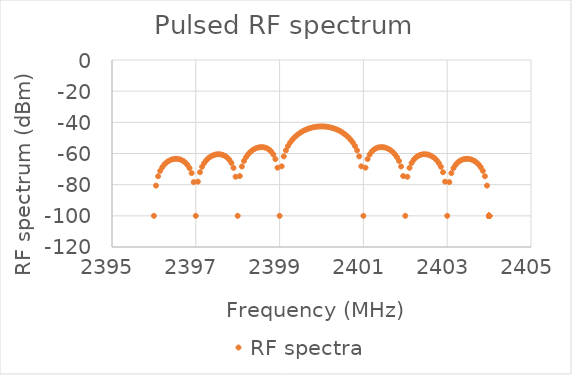
| Category | RF spectra |
|---|---|
| 2396.0 | -100 |
| 2396.05 | -80.609 |
| 2396.1 | -74.585 |
| 2396.15 | -71.132 |
| 2396.2 | -68.775 |
| 2396.25 | -67.055 |
| 2396.3 | -65.768 |
| 2396.35 | -64.812 |
| 2396.4 | -64.126 |
| 2396.45 | -63.676 |
| 2396.5 | -63.445 |
| 2396.55 | -63.428 |
| 2396.6 | -63.629 |
| 2396.65 | -64.067 |
| 2396.7 | -64.775 |
| 2396.75 | -65.812 |
| 2396.8 | -67.282 |
| 2396.85 | -69.389 |
| 2396.9 | -72.591 |
| 2396.95 | -78.363 |
| 2397.0 | -100 |
| 2397.05 | -78.073 |
| 2397.1 | -72.012 |
| 2397.15 | -68.52 |
| 2397.2 | -66.122 |
| 2397.25 | -64.361 |
| 2397.3 | -63.032 |
| 2397.35 | -62.031 |
| 2397.4 | -61.299 |
| 2397.45 | -60.802 |
| 2397.5 | -60.522 |
| 2397.55 | -60.455 |
| 2397.6 | -60.604 |
| 2397.65 | -60.987 |
| 2397.7 | -61.639 |
| 2397.75 | -62.618 |
| 2397.8 | -64.028 |
| 2397.85 | -66.071 |
| 2397.9 | -69.208 |
| 2397.95 | -74.912 |
| 2398.0 | -100 |
| 2398.05 | -74.478 |
| 2398.1 | -68.339 |
| 2398.15 | -64.766 |
| 2398.2 | -62.285 |
| 2398.25 | -60.435 |
| 2398.3 | -59.013 |
| 2398.35 | -57.916 |
| 2398.4 | -57.082 |
| 2398.45 | -56.478 |
| 2398.5 | -56.085 |
| 2398.55 | -55.899 |
| 2398.6 | -55.922 |
| 2398.65 | -56.173 |
| 2398.7 | -56.683 |
| 2398.75 | -57.512 |
| 2398.8 | -58.763 |
| 2398.85 | -60.637 |
| 2398.9 | -63.592 |
| 2398.95 | -69.101 |
| 2399.0 | -100 |
| 2399.05 | -68.231 |
| 2399.1 | -61.849 |
| 2399.15 | -58.011 |
| 2399.2 | -55.241 |
| 2399.25 | -53.075 |
| 2399.3 | -51.306 |
| 2399.35 | -49.824 |
| 2399.4 | -48.562 |
| 2399.45 | -47.478 |
| 2399.5 | -46.543 |
| 2399.55 | -45.735 |
| 2399.6 | -45.041 |
| 2399.65 | -44.447 |
| 2399.7 | -43.947 |
| 2399.75 | -43.533 |
| 2399.8 | -43.2 |
| 2399.85 | -42.944 |
| 2399.9 | -42.764 |
| 2399.95 | -42.656 |
| 2400.0 | -42.621 |
| 2400.05 | -42.656 |
| 2400.1 | -42.764 |
| 2400.15 | -42.944 |
| 2400.2 | -43.2 |
| 2400.25 | -43.533 |
| 2400.3 | -43.947 |
| 2400.35 | -44.447 |
| 2400.4 | -45.041 |
| 2400.45 | -45.735 |
| 2400.5 | -46.543 |
| 2400.55 | -47.478 |
| 2400.6 | -48.562 |
| 2400.65 | -49.824 |
| 2400.7 | -51.306 |
| 2400.75 | -53.075 |
| 2400.8 | -55.241 |
| 2400.85 | -58.011 |
| 2400.9 | -61.849 |
| 2400.95 | -68.231 |
| 2401.0 | -100 |
| 2401.05 | -69.101 |
| 2401.1 | -63.592 |
| 2401.15 | -60.637 |
| 2401.2 | -58.763 |
| 2401.25 | -57.512 |
| 2401.3 | -56.683 |
| 2401.35 | -56.173 |
| 2401.4 | -55.922 |
| 2401.45 | -55.899 |
| 2401.5 | -56.085 |
| 2401.55 | -56.478 |
| 2401.6 | -57.082 |
| 2401.65 | -57.916 |
| 2401.7 | -59.013 |
| 2401.75 | -60.435 |
| 2401.8 | -62.285 |
| 2401.85 | -64.766 |
| 2401.9 | -68.339 |
| 2401.95 | -74.478 |
| 2402.0 | -100 |
| 2402.05 | -74.912 |
| 2402.1 | -69.208 |
| 2402.15 | -66.071 |
| 2402.2 | -64.028 |
| 2402.25 | -62.618 |
| 2402.3 | -61.639 |
| 2402.35 | -60.987 |
| 2402.4 | -60.604 |
| 2402.45 | -60.455 |
| 2402.5 | -60.522 |
| 2402.55 | -60.802 |
| 2402.6 | -61.299 |
| 2402.65 | -62.031 |
| 2402.7 | -63.032 |
| 2402.75 | -64.361 |
| 2402.8 | -66.122 |
| 2402.85 | -68.52 |
| 2402.9 | -72.012 |
| 2402.95 | -78.073 |
| 2403.0 | -100 |
| 2403.05 | -78.363 |
| 2403.1 | -72.591 |
| 2403.15 | -69.389 |
| 2403.2 | -67.282 |
| 2403.25 | -65.812 |
| 2403.3 | -64.775 |
| 2403.35 | -64.067 |
| 2403.4 | -63.629 |
| 2403.45 | -63.428 |
| 2403.5 | -63.445 |
| 2403.55 | -63.676 |
| 2403.6 | -64.126 |
| 2403.65 | -64.812 |
| 2403.7 | -65.768 |
| 2403.75 | -67.055 |
| 2403.8 | -68.775 |
| 2403.85 | -71.132 |
| 2403.9 | -74.585 |
| 2403.95 | -80.609 |
| 2404.0 | -100 |
| 2404.0 | -100 |
| 2404.0 | -100 |
| 2404.0 | -100 |
| 2404.0 | -100 |
| 2404.0 | -100 |
| 2404.0 | -100 |
| 2404.0 | -100 |
| 2404.0 | -100 |
| 2404.0 | -100 |
| 2404.0 | -100 |
| 2404.0 | -100 |
| 2404.0 | -100 |
| 2404.0 | -100 |
| 2404.0 | -100 |
| 2404.0 | -100 |
| 2404.0 | -100 |
| 2404.0 | -100 |
| 2404.0 | -100 |
| 2404.0 | -100 |
| 2404.0 | -100 |
| 2404.0 | -100 |
| 2404.0 | -100 |
| 2404.0 | -100 |
| 2404.0 | -100 |
| 2404.0 | -100 |
| 2404.0 | -100 |
| 2404.0 | -100 |
| 2404.0 | -100 |
| 2404.0 | -100 |
| 2404.0 | -100 |
| 2404.0 | -100 |
| 2404.0 | -100 |
| 2404.0 | -100 |
| 2404.0 | -100 |
| 2404.0 | -100 |
| 2404.0 | -100 |
| 2404.0 | -100 |
| 2404.0 | -100 |
| 2404.0 | -100 |
| 2404.0 | -100 |
| 2404.0 | -100 |
| 2404.0 | -100 |
| 2404.0 | -100 |
| 2404.0 | -100 |
| 2404.0 | -100 |
| 2404.0 | -100 |
| 2404.0 | -100 |
| 2404.0 | -100 |
| 2404.0 | -100 |
| 2404.0 | -100 |
| 2404.0 | -100 |
| 2404.0 | -100 |
| 2404.0 | -100 |
| 2404.0 | -100 |
| 2404.0 | -100 |
| 2404.0 | -100 |
| 2404.0 | -100 |
| 2404.0 | -100 |
| 2404.0 | -100 |
| 2404.0 | -100 |
| 2404.0 | -100 |
| 2404.0 | -100 |
| 2404.0 | -100 |
| 2404.0 | -100 |
| 2404.0 | -100 |
| 2404.0 | -100 |
| 2404.0 | -100 |
| 2404.0 | -100 |
| 2404.0 | -100 |
| 2404.0 | -100 |
| 2404.0 | -100 |
| 2404.0 | -100 |
| 2404.0 | -100 |
| 2404.0 | -100 |
| 2404.0 | -100 |
| 2404.0 | -100 |
| 2404.0 | -100 |
| 2404.0 | -100 |
| 2404.0 | -100 |
| 2404.0 | -100 |
| 2404.0 | -100 |
| 2404.0 | -100 |
| 2404.0 | -100 |
| 2404.0 | -100 |
| 2404.0 | -100 |
| 2404.0 | -100 |
| 2404.0 | -100 |
| 2404.0 | -100 |
| 2404.0 | -100 |
| 2404.0 | -100 |
| 2404.0 | -100 |
| 2404.0 | -100 |
| 2404.0 | -100 |
| 2404.0 | -100 |
| 2404.0 | -100 |
| 2404.0 | -100 |
| 2404.0 | -100 |
| 2404.0 | -100 |
| 2404.0 | -100 |
| 2404.0 | -100 |
| 2404.0 | -100 |
| 2404.0 | -100 |
| 2404.0 | -100 |
| 2404.0 | -100 |
| 2404.0 | -100 |
| 2404.0 | -100 |
| 2404.0 | -100 |
| 2404.0 | -100 |
| 2404.0 | -100 |
| 2404.0 | -100 |
| 2404.0 | -100 |
| 2404.0 | -100 |
| 2404.0 | -100 |
| 2404.0 | -100 |
| 2404.0 | -100 |
| 2404.0 | -100 |
| 2404.0 | -100 |
| 2404.0 | -100 |
| 2404.0 | -100 |
| 2404.0 | -100 |
| 2404.0 | -100 |
| 2404.0 | -100 |
| 2404.0 | -100 |
| 2404.0 | -100 |
| 2404.0 | -100 |
| 2404.0 | -100 |
| 2404.0 | -100 |
| 2404.0 | -100 |
| 2404.0 | -100 |
| 2404.0 | -100 |
| 2404.0 | -100 |
| 2404.0 | -100 |
| 2404.0 | -100 |
| 2404.0 | -100 |
| 2404.0 | -100 |
| 2404.0 | -100 |
| 2404.0 | -100 |
| 2404.0 | -100 |
| 2404.0 | -100 |
| 2404.0 | -100 |
| 2404.0 | -100 |
| 2404.0 | -100 |
| 2404.0 | -100 |
| 2404.0 | -100 |
| 2404.0 | -100 |
| 2404.0 | -100 |
| 2404.0 | -100 |
| 2404.0 | -100 |
| 2404.0 | -100 |
| 2404.0 | -100 |
| 2404.0 | -100 |
| 2404.0 | -100 |
| 2404.0 | -100 |
| 2404.0 | -100 |
| 2404.0 | -100 |
| 2404.0 | -100 |
| 2404.0 | -100 |
| 2404.0 | -100 |
| 2404.0 | -100 |
| 2404.0 | -100 |
| 2404.0 | -100 |
| 2404.0 | -100 |
| 2404.0 | -100 |
| 2404.0 | -100 |
| 2404.0 | -100 |
| 2404.0 | -100 |
| 2404.0 | -100 |
| 2404.0 | -100 |
| 2404.0 | -100 |
| 2404.0 | -100 |
| 2404.0 | -100 |
| 2404.0 | -100 |
| 2404.0 | -100 |
| 2404.0 | -100 |
| 2404.0 | -100 |
| 2404.0 | -100 |
| 2404.0 | -100 |
| 2404.0 | -100 |
| 2404.0 | -100 |
| 2404.0 | -100 |
| 2404.0 | -100 |
| 2404.0 | -100 |
| 2404.0 | -100 |
| 2404.0 | -100 |
| 2404.0 | -100 |
| 2404.0 | -100 |
| 2404.0 | -100 |
| 2404.0 | -100 |
| 2404.0 | -100 |
| 2404.0 | -100 |
| 2404.0 | -100 |
| 2404.0 | -100 |
| 2404.0 | -100 |
| 2404.0 | -100 |
| 2404.0 | -100 |
| 2404.0 | -100 |
| 2404.0 | -100 |
| 2404.0 | -100 |
| 2404.0 | -100 |
| 2404.0 | -100 |
| 2404.0 | -100 |
| 2404.0 | -100 |
| 2404.0 | -100 |
| 2404.0 | -100 |
| 2404.0 | -100 |
| 2404.0 | -100 |
| 2404.0 | -100 |
| 2404.0 | -100 |
| 2404.0 | -100 |
| 2404.0 | -100 |
| 2404.0 | -100 |
| 2404.0 | -100 |
| 2404.0 | -100 |
| 2404.0 | -100 |
| 2404.0 | -100 |
| 2404.0 | -100 |
| 2404.0 | -100 |
| 2404.0 | -100 |
| 2404.0 | -100 |
| 2404.0 | -100 |
| 2404.0 | -100 |
| 2404.0 | -100 |
| 2404.0 | -100 |
| 2404.0 | -100 |
| 2404.0 | -100 |
| 2404.0 | -100 |
| 2404.0 | -100 |
| 2404.0 | -100 |
| 2404.0 | -100 |
| 2404.0 | -100 |
| 2404.0 | -100 |
| 2404.0 | -100 |
| 2404.0 | -100 |
| 2404.0 | -100 |
| 2404.0 | -100 |
| 2404.0 | -100 |
| 2404.0 | -100 |
| 2404.0 | -100 |
| 2404.0 | -100 |
| 2404.0 | -100 |
| 2404.0 | -100 |
| 2404.0 | -100 |
| 2404.0 | -100 |
| 2404.0 | -100 |
| 2404.0 | -100 |
| 2404.0 | -100 |
| 2404.0 | -100 |
| 2404.0 | -100 |
| 2404.0 | -100 |
| 2404.0 | -100 |
| 2404.0 | -100 |
| 2404.0 | -100 |
| 2404.0 | -100 |
| 2404.0 | -100 |
| 2404.0 | -100 |
| 2404.0 | -100 |
| 2404.0 | -100 |
| 2404.0 | -100 |
| 2404.0 | -100 |
| 2404.0 | -100 |
| 2404.0 | -100 |
| 2404.0 | -100 |
| 2404.0 | -100 |
| 2404.0 | -100 |
| 2404.0 | -100 |
| 2404.0 | -100 |
| 2404.0 | -100 |
| 2404.0 | -100 |
| 2404.0 | -100 |
| 2404.0 | -100 |
| 2404.0 | -100 |
| 2404.0 | -100 |
| 2404.0 | -100 |
| 2404.0 | -100 |
| 2404.0 | -100 |
| 2404.0 | -100 |
| 2404.0 | -100 |
| 2404.0 | -100 |
| 2404.0 | -100 |
| 2404.0 | -100 |
| 2404.0 | -100 |
| 2404.0 | -100 |
| 2404.0 | -100 |
| 2404.0 | -100 |
| 2404.0 | -100 |
| 2404.0 | -100 |
| 2404.0 | -100 |
| 2404.0 | -100 |
| 2404.0 | -100 |
| 2404.0 | -100 |
| 2404.0 | -100 |
| 2404.0 | -100 |
| 2404.0 | -100 |
| 2404.0 | -100 |
| 2404.0 | -100 |
| 2404.0 | -100 |
| 2404.0 | -100 |
| 2404.0 | -100 |
| 2404.0 | -100 |
| 2404.0 | -100 |
| 2404.0 | -100 |
| 2404.0 | -100 |
| 2404.0 | -100 |
| 2404.0 | -100 |
| 2404.0 | -100 |
| 2404.0 | -100 |
| 2404.0 | -100 |
| 2404.0 | -100 |
| 2404.0 | -100 |
| 2404.0 | -100 |
| 2404.0 | -100 |
| 2404.0 | -100 |
| 2404.0 | -100 |
| 2404.0 | -100 |
| 2404.0 | -100 |
| 2404.0 | -100 |
| 2404.0 | -100 |
| 2404.0 | -100 |
| 2404.0 | -100 |
| 2404.0 | -100 |
| 2404.0 | -100 |
| 2404.0 | -100 |
| 2404.0 | -100 |
| 2404.0 | -100 |
| 2404.0 | -100 |
| 2404.0 | -100 |
| 2404.0 | -100 |
| 2404.0 | -100 |
| 2404.0 | -100 |
| 2404.0 | -100 |
| 2404.0 | -100 |
| 2404.0 | -100 |
| 2404.0 | -100 |
| 2404.0 | -100 |
| 2404.0 | -100 |
| 2404.0 | -100 |
| 2404.0 | -100 |
| 2404.0 | -100 |
| 2404.0 | -100 |
| 2404.0 | -100 |
| 2404.0 | -100 |
| 2404.0 | -100 |
| 2404.0 | -100 |
| 2404.0 | -100 |
| 2404.0 | -100 |
| 2404.0 | -100 |
| 2404.0 | -100 |
| 2404.0 | -100 |
| 2404.0 | -100 |
| 2404.0 | -100 |
| 2404.0 | -100 |
| 2404.0 | -100 |
| 2404.0 | -100 |
| 2404.0 | -100 |
| 2404.0 | -100 |
| 2404.0 | -100 |
| 2404.0 | -100 |
| 2404.0 | -100 |
| 2404.0 | -100 |
| 2404.0 | -100 |
| 2404.0 | -100 |
| 2404.0 | -100 |
| 2404.0 | -100 |
| 2404.0 | -100 |
| 2404.0 | -100 |
| 2404.0 | -100 |
| 2404.0 | -100 |
| 2404.0 | -100 |
| 2404.0 | -100 |
| 2404.0 | -100 |
| 2404.0 | -100 |
| 2404.0 | -100 |
| 2404.0 | -100 |
| 2404.0 | -100 |
| 2404.0 | -100 |
| 2404.0 | -100 |
| 2404.0 | -100 |
| 2404.0 | -100 |
| 2404.0 | -100 |
| 2404.0 | -100 |
| 2404.0 | -100 |
| 2404.0 | -100 |
| 2404.0 | -100 |
| 2404.0 | -100 |
| 2404.0 | -100 |
| 2404.0 | -100 |
| 2404.0 | -100 |
| 2404.0 | -100 |
| 2404.0 | -100 |
| 2404.0 | -100 |
| 2404.0 | -100 |
| 2404.0 | -100 |
| 2404.0 | -100 |
| 2404.0 | -100 |
| 2404.0 | -100 |
| 2404.0 | -100 |
| 2404.0 | -100 |
| 2404.0 | -100 |
| 2404.0 | -100 |
| 2404.0 | -100 |
| 2404.0 | -100 |
| 2404.0 | -100 |
| 2404.0 | -100 |
| 2404.0 | -100 |
| 2404.0 | -100 |
| 2404.0 | -100 |
| 2404.0 | -100 |
| 2404.0 | -100 |
| 2404.0 | -100 |
| 2404.0 | -100 |
| 2404.0 | -100 |
| 2404.0 | -100 |
| 2404.0 | -100 |
| 2404.0 | -100 |
| 2404.0 | -100 |
| 2404.0 | -100 |
| 2404.0 | -100 |
| 2404.0 | -100 |
| 2404.0 | -100 |
| 2404.0 | -100 |
| 2404.0 | -100 |
| 2404.0 | -100 |
| 2404.0 | -100 |
| 2404.0 | -100 |
| 2404.0 | -100 |
| 2404.0 | -100 |
| 2404.0 | -100 |
| 2404.0 | -100 |
| 2404.0 | -100 |
| 2404.0 | -100 |
| 2404.0 | -100 |
| 2404.0 | -100 |
| 2404.0 | -100 |
| 2404.0 | -100 |
| 2404.0 | -100 |
| 2404.0 | -100 |
| 2404.0 | -100 |
| 2404.0 | -100 |
| 2404.0 | -100 |
| 2404.0 | -100 |
| 2404.0 | -100 |
| 2404.0 | -100 |
| 2404.0 | -100 |
| 2404.0 | -100 |
| 2404.0 | -100 |
| 2404.0 | -100 |
| 2404.0 | -100 |
| 2404.0 | -100 |
| 2404.0 | -100 |
| 2404.0 | -100 |
| 2404.0 | -100 |
| 2404.0 | -100 |
| 2404.0 | -100 |
| 2404.0 | -100 |
| 2404.0 | -100 |
| 2404.0 | -100 |
| 2404.0 | -100 |
| 2404.0 | -100 |
| 2404.0 | -100 |
| 2404.0 | -100 |
| 2404.0 | -100 |
| 2404.0 | -100 |
| 2404.0 | -100 |
| 2404.0 | -100 |
| 2404.0 | -100 |
| 2404.0 | -100 |
| 2404.0 | -100 |
| 2404.0 | -100 |
| 2404.0 | -100 |
| 2404.0 | -100 |
| 2404.0 | -100 |
| 2404.0 | -100 |
| 2404.0 | -100 |
| 2404.0 | -100 |
| 2404.0 | -100 |
| 2404.0 | -100 |
| 2404.0 | -100 |
| 2404.0 | -100 |
| 2404.0 | -100 |
| 2404.0 | -100 |
| 2404.0 | -100 |
| 2404.0 | -100 |
| 2404.0 | -100 |
| 2404.0 | -100 |
| 2404.0 | -100 |
| 2404.0 | -100 |
| 2404.0 | -100 |
| 2404.0 | -100 |
| 2404.0 | -100 |
| 2404.0 | -100 |
| 2404.0 | -100 |
| 2404.0 | -100 |
| 2404.0 | -100 |
| 2404.0 | -100 |
| 2404.0 | -100 |
| 2404.0 | -100 |
| 2404.0 | -100 |
| 2404.0 | -100 |
| 2404.0 | -100 |
| 2404.0 | -100 |
| 2404.0 | -100 |
| 2404.0 | -100 |
| 2404.0 | -100 |
| 2404.0 | -100 |
| 2404.0 | -100 |
| 2404.0 | -100 |
| 2404.0 | -100 |
| 2404.0 | -100 |
| 2404.0 | -100 |
| 2404.0 | -100 |
| 2404.0 | -100 |
| 2404.0 | -100 |
| 2404.0 | -100 |
| 2404.0 | -100 |
| 2404.0 | -100 |
| 2404.0 | -100 |
| 2404.0 | -100 |
| 2404.0 | -100 |
| 2404.0 | -100 |
| 2404.0 | -100 |
| 2404.0 | -100 |
| 2404.0 | -100 |
| 2404.0 | -100 |
| 2404.0 | -100 |
| 2404.0 | -100 |
| 2404.0 | -100 |
| 2404.0 | -100 |
| 2404.0 | -100 |
| 2404.0 | -100 |
| 2404.0 | -100 |
| 2404.0 | -100 |
| 2404.0 | -100 |
| 2404.0 | -100 |
| 2404.0 | -100 |
| 2404.0 | -100 |
| 2404.0 | -100 |
| 2404.0 | -100 |
| 2404.0 | -100 |
| 2404.0 | -100 |
| 2404.0 | -100 |
| 2404.0 | -100 |
| 2404.0 | -100 |
| 2404.0 | -100 |
| 2404.0 | -100 |
| 2404.0 | -100 |
| 2404.0 | -100 |
| 2404.0 | -100 |
| 2404.0 | -100 |
| 2404.0 | -100 |
| 2404.0 | -100 |
| 2404.0 | -100 |
| 2404.0 | -100 |
| 2404.0 | -100 |
| 2404.0 | -100 |
| 2404.0 | -100 |
| 2404.0 | -100 |
| 2404.0 | -100 |
| 2404.0 | -100 |
| 2404.0 | -100 |
| 2404.0 | -100 |
| 2404.0 | -100 |
| 2404.0 | -100 |
| 2404.0 | -100 |
| 2404.0 | -100 |
| 2404.0 | -100 |
| 2404.0 | -100 |
| 2404.0 | -100 |
| 2404.0 | -100 |
| 2404.0 | -100 |
| 2404.0 | -100 |
| 2404.0 | -100 |
| 2404.0 | -100 |
| 2404.0 | -100 |
| 2404.0 | -100 |
| 2404.0 | -100 |
| 2404.0 | -100 |
| 2404.0 | -100 |
| 2404.0 | -100 |
| 2404.0 | -100 |
| 2404.0 | -100 |
| 2404.0 | -100 |
| 2404.0 | -100 |
| 2404.0 | -100 |
| 2404.0 | -100 |
| 2404.0 | -100 |
| 2404.0 | -100 |
| 2404.0 | -100 |
| 2404.0 | -100 |
| 2404.0 | -100 |
| 2404.0 | -100 |
| 2404.0 | -100 |
| 2404.0 | -100 |
| 2404.0 | -100 |
| 2404.0 | -100 |
| 2404.0 | -100 |
| 2404.0 | -100 |
| 2404.0 | -100 |
| 2404.0 | -100 |
| 2404.0 | -100 |
| 2404.0 | -100 |
| 2404.0 | -100 |
| 2404.0 | -100 |
| 2404.0 | -100 |
| 2404.0 | -100 |
| 2404.0 | -100 |
| 2404.0 | -100 |
| 2404.0 | -100 |
| 2404.0 | -100 |
| 2404.0 | -100 |
| 2404.0 | -100 |
| 2404.0 | -100 |
| 2404.0 | -100 |
| 2404.0 | -100 |
| 2404.0 | -100 |
| 2404.0 | -100 |
| 2404.0 | -100 |
| 2404.0 | -100 |
| 2404.0 | -100 |
| 2404.0 | -100 |
| 2404.0 | -100 |
| 2404.0 | -100 |
| 2404.0 | -100 |
| 2404.0 | -100 |
| 2404.0 | -100 |
| 2404.0 | -100 |
| 2404.0 | -100 |
| 2404.0 | -100 |
| 2404.0 | -100 |
| 2404.0 | -100 |
| 2404.0 | -100 |
| 2404.0 | -100 |
| 2404.0 | -100 |
| 2404.0 | -100 |
| 2404.0 | -100 |
| 2404.0 | -100 |
| 2404.0 | -100 |
| 2404.0 | -100 |
| 2404.0 | -100 |
| 2404.0 | -100 |
| 2404.0 | -100 |
| 2404.0 | -100 |
| 2404.0 | -100 |
| 2404.0 | -100 |
| 2404.0 | -100 |
| 2404.0 | -100 |
| 2404.0 | -100 |
| 2404.0 | -100 |
| 2404.0 | -100 |
| 2404.0 | -100 |
| 2404.0 | -100 |
| 2404.0 | -100 |
| 2404.0 | -100 |
| 2404.0 | -100 |
| 2404.0 | -100 |
| 2404.0 | -100 |
| 2404.0 | -100 |
| 2404.0 | -100 |
| 2404.0 | -100 |
| 2404.0 | -100 |
| 2404.0 | -100 |
| 2404.0 | -100 |
| 2404.0 | -100 |
| 2404.0 | -100 |
| 2404.0 | -100 |
| 2404.0 | -100 |
| 2404.0 | -100 |
| 2404.0 | -100 |
| 2404.0 | -100 |
| 2404.0 | -100 |
| 2404.0 | -100 |
| 2404.0 | -100 |
| 2404.0 | -100 |
| 2404.0 | -100 |
| 2404.0 | -100 |
| 2404.0 | -100 |
| 2404.0 | -100 |
| 2404.0 | -100 |
| 2404.0 | -100 |
| 2404.0 | -100 |
| 2404.0 | -100 |
| 2404.0 | -100 |
| 2404.0 | -100 |
| 2404.0 | -100 |
| 2404.0 | -100 |
| 2404.0 | -100 |
| 2404.0 | -100 |
| 2404.0 | -100 |
| 2404.0 | -100 |
| 2404.0 | -100 |
| 2404.0 | -100 |
| 2404.0 | -100 |
| 2404.0 | -100 |
| 2404.0 | -100 |
| 2404.0 | -100 |
| 2404.0 | -100 |
| 2404.0 | -100 |
| 2404.0 | -100 |
| 2404.0 | -100 |
| 2404.0 | -100 |
| 2404.0 | -100 |
| 2404.0 | -100 |
| 2404.0 | -100 |
| 2404.0 | -100 |
| 2404.0 | -100 |
| 2404.0 | -100 |
| 2404.0 | -100 |
| 2404.0 | -100 |
| 2404.0 | -100 |
| 2404.0 | -100 |
| 2404.0 | -100 |
| 2404.0 | -100 |
| 2404.0 | -100 |
| 2404.0 | -100 |
| 2404.0 | -100 |
| 2404.0 | -100 |
| 2404.0 | -100 |
| 2404.0 | -100 |
| 2404.0 | -100 |
| 2404.0 | -100 |
| 2404.0 | -100 |
| 2404.0 | -100 |
| 2404.0 | -100 |
| 2404.0 | -100 |
| 2404.0 | -100 |
| 2404.0 | -100 |
| 2404.0 | -100 |
| 2404.0 | -100 |
| 2404.0 | -100 |
| 2404.0 | -100 |
| 2404.0 | -100 |
| 2404.0 | -100 |
| 2404.0 | -100 |
| 2404.0 | -100 |
| 2404.0 | -100 |
| 2404.0 | -100 |
| 2404.0 | -100 |
| 2404.0 | -100 |
| 2404.0 | -100 |
| 2404.0 | -100 |
| 2404.0 | -100 |
| 2404.0 | -100 |
| 2404.0 | -100 |
| 2404.0 | -100 |
| 2404.0 | -100 |
| 2404.0 | -100 |
| 2404.0 | -100 |
| 2404.0 | -100 |
| 2404.0 | -100 |
| 2404.0 | -100 |
| 2404.0 | -100 |
| 2404.0 | -100 |
| 2404.0 | -100 |
| 2404.0 | -100 |
| 2404.0 | -100 |
| 2404.0 | -100 |
| 2404.0 | -100 |
| 2404.0 | -100 |
| 2404.0 | -100 |
| 2404.0 | -100 |
| 2404.0 | -100 |
| 2404.0 | -100 |
| 2404.0 | -100 |
| 2404.0 | -100 |
| 2404.0 | -100 |
| 2404.0 | -100 |
| 2404.0 | -100 |
| 2404.0 | -100 |
| 2404.0 | -100 |
| 2404.0 | -100 |
| 2404.0 | -100 |
| 2404.0 | -100 |
| 2404.0 | -100 |
| 2404.0 | -100 |
| 2404.0 | -100 |
| 2404.0 | -100 |
| 2404.0 | -100 |
| 2404.0 | -100 |
| 2404.0 | -100 |
| 2404.0 | -100 |
| 2404.0 | -100 |
| 2404.0 | -100 |
| 2404.0 | -100 |
| 2404.0 | -100 |
| 2404.0 | -100 |
| 2404.0 | -100 |
| 2404.0 | -100 |
| 2404.0 | -100 |
| 2404.0 | -100 |
| 2404.0 | -100 |
| 2404.0 | -100 |
| 2404.0 | -100 |
| 2404.0 | -100 |
| 2404.0 | -100 |
| 2404.0 | -100 |
| 2404.0 | -100 |
| 2404.0 | -100 |
| 2404.0 | -100 |
| 2404.0 | -100 |
| 2404.0 | -100 |
| 2404.0 | -100 |
| 2404.0 | -100 |
| 2404.0 | -100 |
| 2404.0 | -100 |
| 2404.0 | -100 |
| 2404.0 | -100 |
| 2404.0 | -100 |
| 2404.0 | -100 |
| 2404.0 | -100 |
| 2404.0 | -100 |
| 2404.0 | -100 |
| 2404.0 | -100 |
| 2404.0 | -100 |
| 2404.0 | -100 |
| 2404.0 | -100 |
| 2404.0 | -100 |
| 2404.0 | -100 |
| 2404.0 | -100 |
| 2404.0 | -100 |
| 2404.0 | -100 |
| 2404.0 | -100 |
| 2404.0 | -100 |
| 2404.0 | -100 |
| 2404.0 | -100 |
| 2404.0 | -100 |
| 2404.0 | -100 |
| 2404.0 | -100 |
| 2404.0 | -100 |
| 2404.0 | -100 |
| 2404.0 | -100 |
| 2404.0 | -100 |
| 2404.0 | -100 |
| 2404.0 | -100 |
| 2404.0 | -100 |
| 2404.0 | -100 |
| 2404.0 | -100 |
| 2404.0 | -100 |
| 2404.0 | -100 |
| 2404.0 | -100 |
| 2404.0 | -100 |
| 2404.0 | -100 |
| 2404.0 | -100 |
| 2404.0 | -100 |
| 2404.0 | -100 |
| 2404.0 | -100 |
| 2404.0 | -100 |
| 2404.0 | -100 |
| 2404.0 | -100 |
| 2404.0 | -100 |
| 2404.0 | -100 |
| 2404.0 | -100 |
| 2404.0 | -100 |
| 2404.0 | -100 |
| 2404.0 | -100 |
| 2404.0 | -100 |
| 2404.0 | -100 |
| 2404.0 | -100 |
| 2404.0 | -100 |
| 2404.0 | -100 |
| 2404.0 | -100 |
| 2404.0 | -100 |
| 2404.0 | -100 |
| 2404.0 | -100 |
| 2404.0 | -100 |
| 2404.0 | -100 |
| 2404.0 | -100 |
| 2404.0 | -100 |
| 2404.0 | -100 |
| 2404.0 | -100 |
| 2404.0 | -100 |
| 2404.0 | -100 |
| 2404.0 | -100 |
| 2404.0 | -100 |
| 2404.0 | -100 |
| 2404.0 | -100 |
| 2404.0 | -100 |
| 2404.0 | -100 |
| 2404.0 | -100 |
| 2404.0 | -100 |
| 2404.0 | -100 |
| 2404.0 | -100 |
| 2404.0 | -100 |
| 2404.0 | -100 |
| 2404.0 | -100 |
| 2404.0 | -100 |
| 2404.0 | -100 |
| 2404.0 | -100 |
| 2404.0 | -100 |
| 2404.0 | -100 |
| 2404.0 | -100 |
| 2404.0 | -100 |
| 2404.0 | -100 |
| 2404.0 | -100 |
| 2404.0 | -100 |
| 2404.0 | -100 |
| 2404.0 | -100 |
| 2404.0 | -100 |
| 2404.0 | -100 |
| 2404.0 | -100 |
| 2404.0 | -100 |
| 2404.0 | -100 |
| 2404.0 | -100 |
| 2404.0 | -100 |
| 2404.0 | -100 |
| 2404.0 | -100 |
| 2404.0 | -100 |
| 2404.0 | -100 |
| 2404.0 | -100 |
| 2404.0 | -100 |
| 2404.0 | -100 |
| 2404.0 | -100 |
| 2404.0 | -100 |
| 2404.0 | -100 |
| 2404.0 | -100 |
| 2404.0 | -100 |
| 2404.0 | -100 |
| 2404.0 | -100 |
| 2404.0 | -100 |
| 2404.0 | -100 |
| 2404.0 | -100 |
| 2404.0 | -100 |
| 2404.0 | -100 |
| 2404.0 | -100 |
| 2404.0 | -100 |
| 2404.0 | -100 |
| 2404.0 | -100 |
| 2404.0 | -100 |
| 2404.0 | -100 |
| 2404.0 | -100 |
| 2404.0 | -100 |
| 2404.0 | -100 |
| 2404.0 | -100 |
| 2404.0 | -100 |
| 2404.0 | -100 |
| 2404.0 | -100 |
| 2404.0 | -100 |
| 2404.0 | -100 |
| 2404.0 | -100 |
| 2404.0 | -100 |
| 2404.0 | -100 |
| 2404.0 | -100 |
| 2404.0 | -100 |
| 2404.0 | -100 |
| 2404.0 | -100 |
| 2404.0 | -100 |
| 2404.0 | -100 |
| 2404.0 | -100 |
| 2404.0 | -100 |
| 2404.0 | -100 |
| 2404.0 | -100 |
| 2404.0 | -100 |
| 2404.0 | -100 |
| 2404.0 | -100 |
| 2404.0 | -100 |
| 2404.0 | -100 |
| 2404.0 | -100 |
| 2404.0 | -100 |
| 2404.0 | -100 |
| 2404.0 | -100 |
| 2404.0 | -100 |
| 2404.0 | -100 |
| 2404.0 | -100 |
| 2404.0 | -100 |
| 2404.0 | -100 |
| 2404.0 | -100 |
| 2404.0 | -100 |
| 2404.0 | -100 |
| 2404.0 | -100 |
| 2404.0 | -100 |
| 2404.0 | -100 |
| 2404.0 | -100 |
| 2404.0 | -100 |
| 2404.0 | -100 |
| 2404.0 | -100 |
| 2404.0 | -100 |
| 2404.0 | -100 |
| 2404.0 | -100 |
| 2404.0 | -100 |
| 2404.0 | -100 |
| 2404.0 | -100 |
| 2404.0 | -100 |
| 2404.0 | -100 |
| 2404.0 | -100 |
| 2404.0 | -100 |
| 2404.0 | -100 |
| 2404.0 | -100 |
| 2404.0 | -100 |
| 2404.0 | -100 |
| 2404.0 | -100 |
| 2404.0 | -100 |
| 2404.0 | -100 |
| 2404.0 | -100 |
| 2404.0 | -100 |
| 2404.0 | -100 |
| 2404.0 | -100 |
| 2404.0 | -100 |
| 2404.0 | -100 |
| 2404.0 | -100 |
| 2404.0 | -100 |
| 2404.0 | -100 |
| 2404.0 | -100 |
| 2404.0 | -100 |
| 2404.0 | -100 |
| 2404.0 | -100 |
| 2404.0 | -100 |
| 2404.0 | -100 |
| 2404.0 | -100 |
| 2404.0 | -100 |
| 2404.0 | -100 |
| 2404.0 | -100 |
| 2404.0 | -100 |
| 2404.0 | -100 |
| 2404.0 | -100 |
| 2404.0 | -100 |
| 2404.0 | -100 |
| 2404.0 | -100 |
| 2404.0 | -100 |
| 2404.0 | -100 |
| 2404.0 | -100 |
| 2404.0 | -100 |
| 2404.0 | -100 |
| 2404.0 | -100 |
| 2404.0 | -100 |
| 2404.0 | -100 |
| 2404.0 | -100 |
| 2404.0 | -100 |
| 2404.0 | -100 |
| 2404.0 | -100 |
| 2404.0 | -100 |
| 2404.0 | -100 |
| 2404.0 | -100 |
| 2404.0 | -100 |
| 2404.0 | -100 |
| 2404.0 | -100 |
| 2404.0 | -100 |
| 2404.0 | -100 |
| 2404.0 | -100 |
| 2404.0 | -100 |
| 2404.0 | -100 |
| 2404.0 | -100 |
| 2404.0 | -100 |
| 2404.0 | -100 |
| 2404.0 | -100 |
| 2404.0 | -100 |
| 2404.0 | -100 |
| 2404.0 | -100 |
| 2404.0 | -100 |
| 2404.0 | -100 |
| 2404.0 | -100 |
| 2404.0 | -100 |
| 2404.0 | -100 |
| 2404.0 | -100 |
| 2404.0 | -100 |
| 2404.0 | -100 |
| 2404.0 | -100 |
| 2404.0 | -100 |
| 2404.0 | -100 |
| 2404.0 | -100 |
| 2404.0 | -100 |
| 2404.0 | -100 |
| 2404.0 | -100 |
| 2404.0 | -100 |
| 2404.0 | -100 |
| 2404.0 | -100 |
| 2404.0 | -100 |
| 2404.0 | -100 |
| 2404.0 | -100 |
| 2404.0 | -100 |
| 2404.0 | -100 |
| 2404.0 | -100 |
| 2404.0 | -100 |
| 2404.0 | -100 |
| 2404.0 | -100 |
| 2404.0 | -100 |
| 2404.0 | -100 |
| 2404.0 | -100 |
| 2404.0 | -100 |
| 2404.0 | -100 |
| 2404.0 | -100 |
| 2404.0 | -100 |
| 2404.0 | -100 |
| 2404.0 | -100 |
| 2404.0 | -100 |
| 2404.0 | -100 |
| 2404.0 | -100 |
| 2404.0 | -100 |
| 2404.0 | -100 |
| 2404.0 | -100 |
| 2404.0 | -100 |
| 2404.0 | -100 |
| 2404.0 | -100 |
| 2404.0 | -100 |
| 2404.0 | -100 |
| 2404.0 | -100 |
| 2404.0 | -100 |
| 2404.0 | -100 |
| 2404.0 | -100 |
| 2404.0 | -100 |
| 2404.0 | -100 |
| 2404.0 | -100 |
| 2404.0 | -100 |
| 2404.0 | -100 |
| 2404.0 | -100 |
| 2404.0 | -100 |
| 2404.0 | -100 |
| 2404.0 | -100 |
| 2404.0 | -100 |
| 2404.0 | -100 |
| 2404.0 | -100 |
| 2404.0 | -100 |
| 2404.0 | -100 |
| 2404.0 | -100 |
| 2404.0 | -100 |
| 2404.0 | -100 |
| 2404.0 | -100 |
| 2404.0 | -100 |
| 2404.0 | -100 |
| 2404.0 | -100 |
| 2404.0 | -100 |
| 2404.0 | -100 |
| 2404.0 | -100 |
| 2404.0 | -100 |
| 2404.0 | -100 |
| 2404.0 | -100 |
| 2404.0 | -100 |
| 2404.0 | -100 |
| 2404.0 | -100 |
| 2404.0 | -100 |
| 2404.0 | -100 |
| 2404.0 | -100 |
| 2404.0 | -100 |
| 2404.0 | -100 |
| 2404.0 | -100 |
| 2404.0 | -100 |
| 2404.0 | -100 |
| 2404.0 | -100 |
| 2404.0 | -100 |
| 2404.0 | -100 |
| 2404.0 | -100 |
| 2404.0 | -100 |
| 2404.0 | -100 |
| 2404.0 | -100 |
| 2404.0 | -100 |
| 2404.0 | -100 |
| 2404.0 | -100 |
| 2404.0 | -100 |
| 2404.0 | -100 |
| 2404.0 | -100 |
| 2404.0 | -100 |
| 2404.0 | -100 |
| 2404.0 | -100 |
| 2404.0 | -100 |
| 2404.0 | -100 |
| 2404.0 | -100 |
| 2404.0 | -100 |
| 2404.0 | -100 |
| 2404.0 | -100 |
| 2404.0 | -100 |
| 2404.0 | -100 |
| 2404.0 | -100 |
| 2404.0 | -100 |
| 2404.0 | -100 |
| 2404.0 | -100 |
| 2404.0 | -100 |
| 2404.0 | -100 |
| 2404.0 | -100 |
| 2404.0 | -100 |
| 2404.0 | -100 |
| 2404.0 | -100 |
| 2404.0 | -100 |
| 2404.0 | -100 |
| 2404.0 | -100 |
| 2404.0 | -100 |
| 2404.0 | -100 |
| 2404.0 | -100 |
| 2404.0 | -100 |
| 2404.0 | -100 |
| 2404.0 | -100 |
| 2404.0 | -100 |